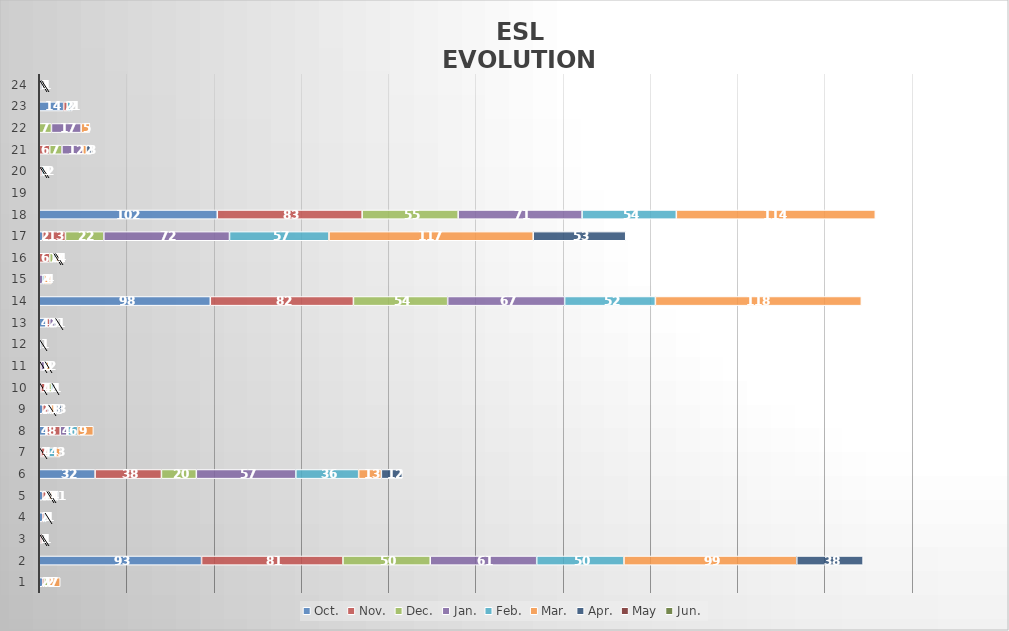
| Category | Oct. | Nov. | Dec. | Jan. | Feb. | Mar. | Apr. | May | Jun. |
|---|---|---|---|---|---|---|---|---|---|
| 0 | 2 | 1 | 2 | 0 | 0 | 7 | 0 | 0 | 0 |
| 1 | 93 | 81 | 50 | 61 | 50 | 99 | 38 | 0 | 0 |
| 2 | 1 | 1 | 0 | 0 | 0 | 0 | 0 | 0 | 0 |
| 3 | 2 | 1 | 0 | 0 | 1 | 0 | 0 | 0 | 0 |
| 4 | 2 | 2 | 1 | 0 | 1 | 4 | 1 | 0 | 0 |
| 5 | 32 | 38 | 20 | 57 | 36 | 13 | 12 | 0 | 0 |
| 6 | 1 | 4 | 0 | 0 | 4 | 3 | 0 | 0 | 0 |
| 7 | 4 | 8 | 0 | 4 | 6 | 9 | 0 | 0 | 0 |
| 8 | 2 | 3 | 0 | 1 | 1 | 3 | 3 | 0 | 0 |
| 9 | 1 | 4 | 2 | 0 | 1 | 0 | 0 | 0 | 0 |
| 10 | 0 | 1 | 0 | 2 | 1 | 2 | 0 | 0 | 0 |
| 11 | 1 | 0 | 0 | 0 | 0 | 0 | 0 | 0 | 0 |
| 12 | 4 | 2 | 0 | 3 | 0 | 0 | 1 | 0 | 0 |
| 13 | 98 | 82 | 54 | 67 | 52 | 118 | 0 | 0 | 0 |
| 14 | 0 | 0 | 0 | 2 | 1 | 4 | 0 | 0 | 0 |
| 15 | 0 | 6 | 2 | 1 | 1 | 4 | 0 | 0 | 0 |
| 16 | 2 | 13 | 22 | 72 | 57 | 117 | 53 | 0 | 0 |
| 17 | 102 | 83 | 55 | 71 | 54 | 114 | 0 | 0 | 0 |
| 18 | 0 | 0 | 0 | 0 | 0 | 0 | 0 | 0 | 0 |
| 19 | 1 | 1 | 0 | 0 | 1 | 2 | 0 | 0 | 0 |
| 20 | 0 | 6 | 7 | 12 | 0 | 2 | 3 | 0 | 0 |
| 21 | 0 | 0 | 7 | 17 | 0 | 5 | 0 | 0 | 0 |
| 22 | 14 | 2 | 0 | 0 | 2 | 0 | 1 | 0 | 0 |
| 23 | 0 | 0 | 0 | 0 | 0 | 1 | 1 | 0 | 0 |